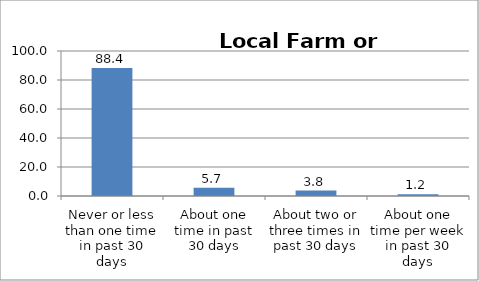
| Category | Series 0 |
|---|---|
| Never or less than one time in past 30 days | 88.357 |
| About one time in past 30 days | 5.658 |
| About two or three times in past 30 days | 3.764 |
| About one time per week in past 30 days | 1.244 |